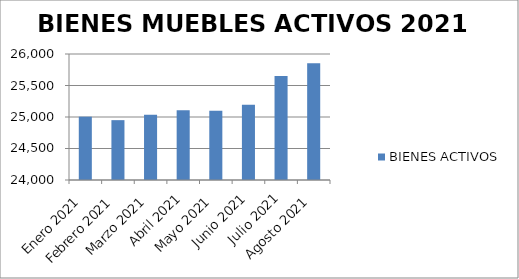
| Category | BIENES ACTIVOS |
|---|---|
| Enero 2021 | 25005 |
| Febrero 2021 | 24950 |
| Marzo 2021 | 25037 |
| Abril 2021 | 25108 |
| Mayo 2021 | 25099 |
| Junio 2021 | 25193 |
| Julio 2021 | 25650 |
| Agosto 2021 | 25853 |